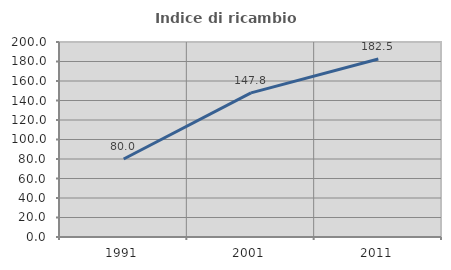
| Category | Indice di ricambio occupazionale  |
|---|---|
| 1991.0 | 80 |
| 2001.0 | 147.826 |
| 2011.0 | 182.5 |